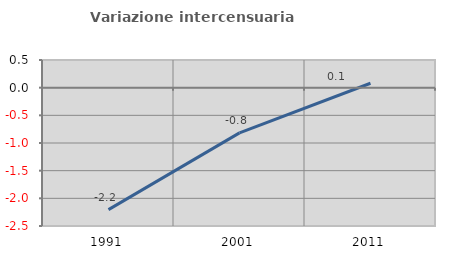
| Category | Variazione intercensuaria annua |
|---|---|
| 1991.0 | -2.204 |
| 2001.0 | -0.817 |
| 2011.0 | 0.08 |